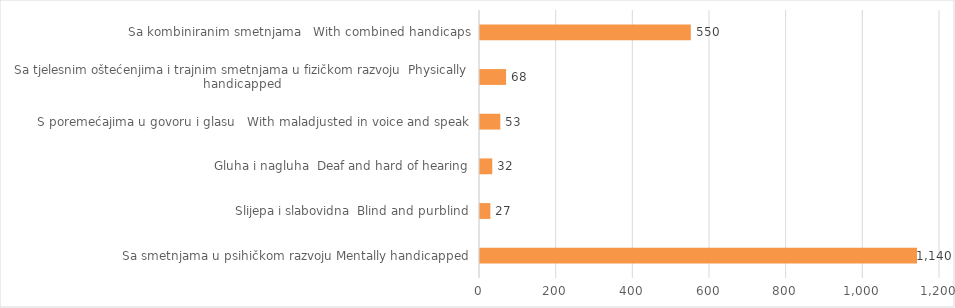
| Category | Series 5 |
|---|---|
| Sa smetnjama u psihičkom razvoju Mentally handicapped | 1140 |
| Slijepa i slabovidna  Blind and purblind | 27 |
| Gluha i nagluha  Deaf and hard of hearing | 32 |
| S poremećajima u govoru i glasu   With maladjusted in voice and speak | 53 |
| Sa tjelesnim oštećenjima i trajnim smetnjama u fizičkom razvoju  Physically handicapped | 68 |
| Sa kombiniranim smetnjama   With combined handicaps | 550 |